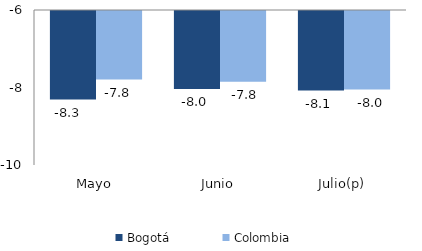
| Category | Bogotá | Colombia |
|---|---|---|
| Mayo | -8.285 | -7.77 |
| Junio | -8.013 | -7.825 |
| Julio(p) | -8.054 | -8.029 |